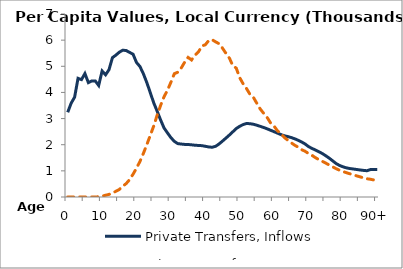
| Category | Private Transfers, Inflows | Private Transfers, Outflows |
|---|---|---|
| 0 | 3240.183 | 0 |
|  | 3589.114 | 0 |
| 2 | 3817.072 | 0 |
| 3 | 4538.881 | 0 |
| 4 | 4490.077 | 0 |
| 5 | 4721.441 | 0 |
| 6 | 4375.781 | 0 |
| 7 | 4441.504 | 0.169 |
| 8 | 4441.401 | 1.314 |
| 9 | 4266.777 | 7.83 |
| 10 | 4820.241 | 31.156 |
| 11 | 4673.95 | 67.197 |
| 12 | 4867.224 | 98.703 |
| 13 | 5328.957 | 150.846 |
| 14 | 5426.085 | 217.848 |
| 15 | 5539.458 | 287.795 |
| 16 | 5615.099 | 413.435 |
| 17 | 5601.91 | 513.761 |
| 18 | 5530.684 | 666.309 |
| 19 | 5460.845 | 871.871 |
| 20 | 5144.364 | 1105.518 |
| 21 | 4991.499 | 1360.024 |
| 22 | 4713.9 | 1668.17 |
| 23 | 4374.982 | 2005.315 |
| 24 | 3992.987 | 2356.873 |
| 25 | 3602.812 | 2715.178 |
| 26 | 3283.068 | 3130.983 |
| 27 | 2948.738 | 3503.172 |
| 28 | 2641.364 | 3832.032 |
| 29 | 2452.459 | 4084.151 |
| 30 | 2270.365 | 4389.515 |
| 31 | 2127.477 | 4717.377 |
| 32 | 2041.761 | 4771.707 |
| 33 | 2025.436 | 4933.97 |
| 34 | 2011.501 | 5158.894 |
| 35 | 2008.783 | 5338.936 |
| 36 | 1995.771 | 5240.672 |
| 37 | 1980.805 | 5425.261 |
| 38 | 1971.315 | 5548.874 |
| 39 | 1963.84 | 5775.587 |
| 40 | 1939.679 | 5823.983 |
| 41 | 1914.499 | 5984.092 |
| 42 | 1902.794 | 6015.458 |
| 43 | 1939.954 | 5933.96 |
| 44 | 2028.565 | 5864.289 |
| 45 | 2139.183 | 5693.614 |
| 46 | 2252.999 | 5496.695 |
| 47 | 2370.351 | 5313.875 |
| 48 | 2494.076 | 5022.879 |
| 49 | 2617.964 | 4929.057 |
| 50 | 2704.565 | 4561.962 |
| 51 | 2770.799 | 4329.339 |
| 52 | 2812.117 | 4144.832 |
| 53 | 2803.313 | 3922.154 |
| 54 | 2782.488 | 3806.712 |
| 55 | 2745.352 | 3579.143 |
| 56 | 2702.087 | 3360.027 |
| 57 | 2657.771 | 3194.938 |
| 58 | 2607.106 | 3037.823 |
| 59 | 2551.955 | 2827.424 |
| 60 | 2498.029 | 2709.057 |
| 61 | 2441.914 | 2528.93 |
| 62 | 2387.607 | 2425.014 |
| 63 | 2342.56 | 2274.342 |
| 64 | 2310.818 | 2170.103 |
| 65 | 2273.041 | 2069.807 |
| 66 | 2226.365 | 1981.147 |
| 67 | 2169.672 | 1904.039 |
| 68 | 2105.118 | 1810.757 |
| 69 | 2029.611 | 1750.521 |
| 70 | 1930.123 | 1664.995 |
| 71 | 1858.881 | 1595.805 |
| 72 | 1799.164 | 1506.279 |
| 73 | 1732.503 | 1431.42 |
| 74 | 1663.84 | 1364.246 |
| 75 | 1579.813 | 1297.659 |
| 76 | 1488.346 | 1226.804 |
| 77 | 1387.699 | 1154.965 |
| 78 | 1281.236 | 1084.883 |
| 79 | 1208.934 | 1026.057 |
| 80 | 1155.766 | 975.428 |
| 81 | 1115.353 | 931.416 |
| 82 | 1088.883 | 889.476 |
| 83 | 1072.055 | 847.205 |
| 84 | 1052.245 | 808.75 |
| 85 | 1033.827 | 770.749 |
| 86 | 1017.752 | 733.777 |
| 87 | 1004.653 | 698.237 |
| 88 | 1049.74 | 679.175 |
| 89 | 1054.176 | 651.238 |
| 90+ | 1056.257 | 624.049 |